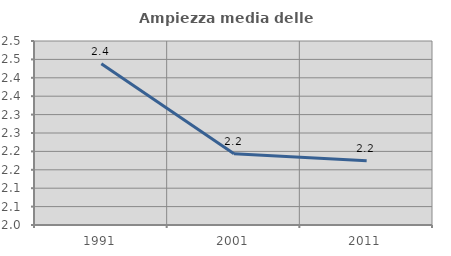
| Category | Ampiezza media delle famiglie |
|---|---|
| 1991.0 | 2.438 |
| 2001.0 | 2.194 |
| 2011.0 | 2.175 |